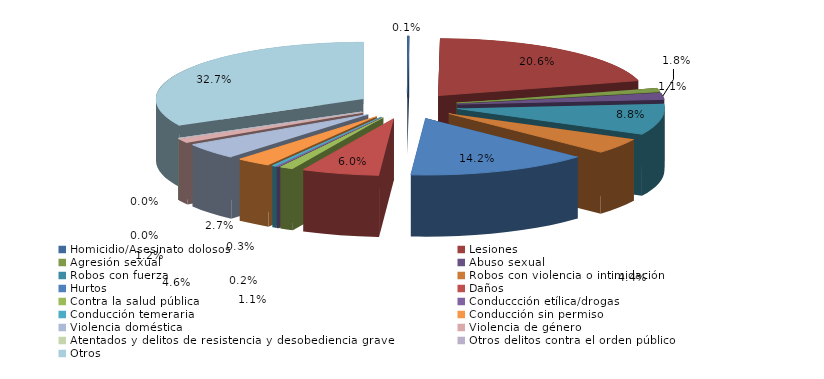
| Category | Series 0 |
|---|---|
| Homicidio/Asesinato dolosos | 4 |
| Lesiones | 580 |
| Agresión sexual | 30 |
| Abuso sexual | 52 |
| Robos con fuerza | 248 |
| Robos con violencia o intimidación | 125 |
| Hurtos | 400 |
| Daños | 170 |
| Contra la salud pública | 30 |
| Conduccción etílica/drogas | 5 |
| Conducción temeraria | 9 |
| Conducción sin permiso | 77 |
| Violencia doméstica | 129 |
| Violencia de género | 35 |
| Atentados y delitos de resistencia y desobediencia grave | 0 |
| Otros delitos contra el orden público | 0 |
| Otros | 920 |